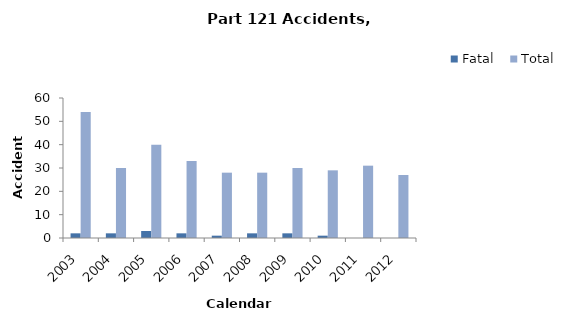
| Category | Fatal | Total |
|---|---|---|
| 2003.0 | 2 | 54 |
| 2004.0 | 2 | 30 |
| 2005.0 | 3 | 40 |
| 2006.0 | 2 | 33 |
| 2007.0 | 1 | 28 |
| 2008.0 | 2 | 28 |
| 2009.0 | 2 | 30 |
| 2010.0 | 1 | 29 |
| 2011.0 | 0 | 31 |
| 2012.0 | 0 | 27 |